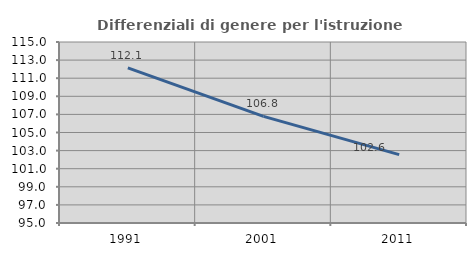
| Category | Differenziali di genere per l'istruzione superiore |
|---|---|
| 1991.0 | 112.148 |
| 2001.0 | 106.787 |
| 2011.0 | 102.555 |